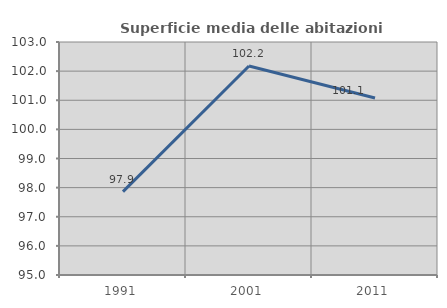
| Category | Superficie media delle abitazioni occupate |
|---|---|
| 1991.0 | 97.863 |
| 2001.0 | 102.175 |
| 2011.0 | 101.075 |